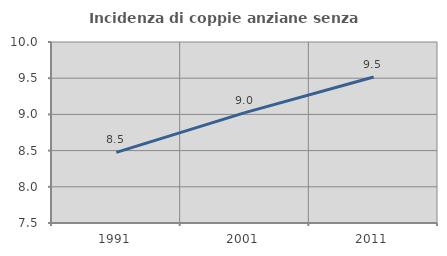
| Category | Incidenza di coppie anziane senza figli  |
|---|---|
| 1991.0 | 8.475 |
| 2001.0 | 9.025 |
| 2011.0 | 9.517 |